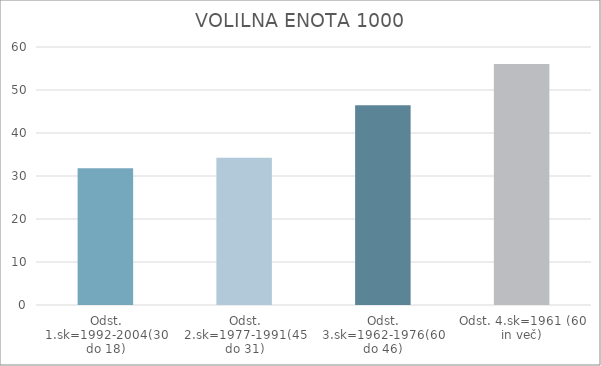
| Category | Series 0 |
|---|---|
| Odst. 1.sk=1992-2004(30 do 18) | 31.82 |
| Odst. 2.sk=1977-1991(45 do 31) | 34.22 |
| Odst. 3.sk=1962-1976(60 do 46) | 46.45 |
| Odst. 4.sk=1961 (60 in več) | 56.06 |